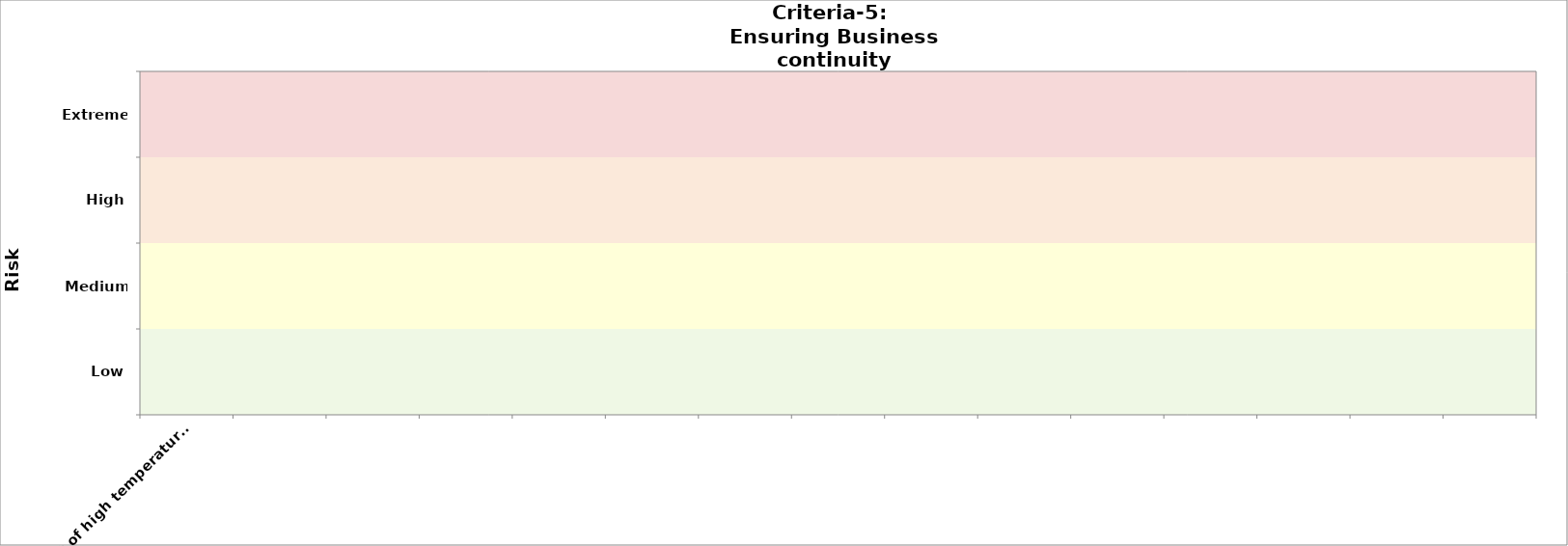
| Category | Criteria-3 (public health) | Criteria-5 
2050 |
|---|---|---|
| e.g. effect of high temperature on road pavement  |  | 0 |